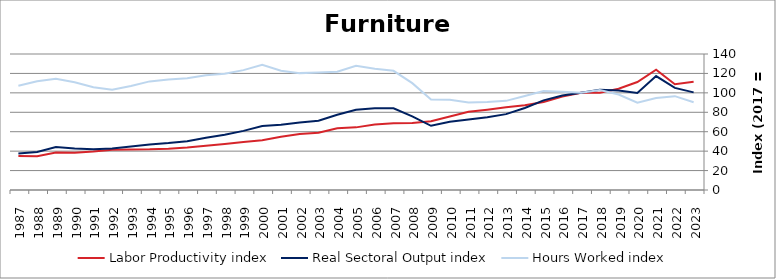
| Category | Labor Productivity index | Real Sectoral Output index | Hours Worked index |
|---|---|---|---|
| 2023.0 | 111.331 | 100.494 | 90.266 |
| 2022.0 | 108.843 | 105.134 | 96.592 |
| 2021.0 | 123.886 | 117.263 | 94.654 |
| 2020.0 | 111.199 | 99.835 | 89.781 |
| 2019.0 | 104.24 | 102.436 | 98.27 |
| 2018.0 | 100.185 | 103.122 | 102.931 |
| 2017.0 | 100 | 100 | 100 |
| 2016.0 | 96.272 | 97.313 | 101.081 |
| 2015.0 | 90.576 | 92.229 | 101.825 |
| 2014.0 | 87.32 | 84.464 | 96.729 |
| 2013.0 | 85.119 | 78.1 | 91.754 |
| 2012.0 | 82.712 | 74.927 | 90.588 |
| 2011.0 | 80.563 | 72.48 | 89.967 |
| 2010.0 | 75.678 | 70.226 | 92.796 |
| 2009.0 | 70.867 | 66.1 | 93.274 |
| 2008.0 | 68.9 | 75.806 | 110.023 |
| 2007.0 | 68.602 | 84.168 | 122.69 |
| 2006.0 | 67.491 | 84.192 | 124.746 |
| 2005.0 | 64.474 | 82.495 | 127.95 |
| 2004.0 | 63.65 | 77.479 | 121.727 |
| 2003.0 | 58.939 | 71.26 | 120.905 |
| 2002.0 | 57.727 | 69.453 | 120.314 |
| 2001.0 | 54.745 | 67.17 | 122.695 |
| 2000.0 | 51.173 | 65.948 | 128.873 |
| 1999.0 | 49.335 | 60.878 | 123.399 |
| 1998.0 | 47.46 | 56.783 | 119.643 |
| 1997.0 | 45.561 | 53.787 | 118.056 |
| 1996.0 | 43.672 | 50.258 | 115.079 |
| 1995.0 | 42.424 | 48.275 | 113.792 |
| 1994.0 | 41.889 | 46.836 | 111.81 |
| 1993.0 | 41.799 | 44.778 | 107.128 |
| 1992.0 | 41.459 | 42.799 | 103.232 |
| 1991.0 | 39.677 | 42.008 | 105.874 |
| 1990.0 | 38.47 | 42.681 | 110.947 |
| 1989.0 | 38.533 | 44.137 | 114.543 |
| 1988.0 | 34.836 | 39.026 | 112.029 |
| 1987.0 | 35.122 | 37.693 | 107.32 |